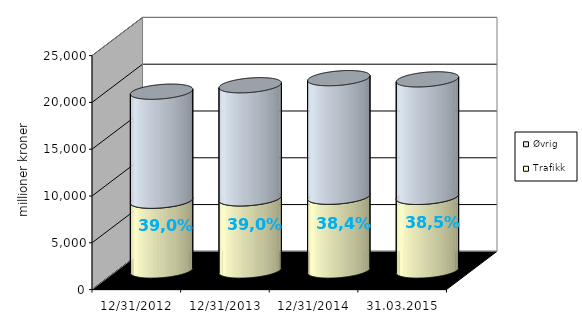
| Category | Trafikk | Øvrig |
|---|---|---|
| 31.12.2012 | 7457.552 | 11647.433 |
| 31.12.2013 | 7709.892 | 12083.527 |
| 31.12.2014 | 7884.668 | 12665.925 |
| 31.03.2015 | 7865.527 | 12555.833 |